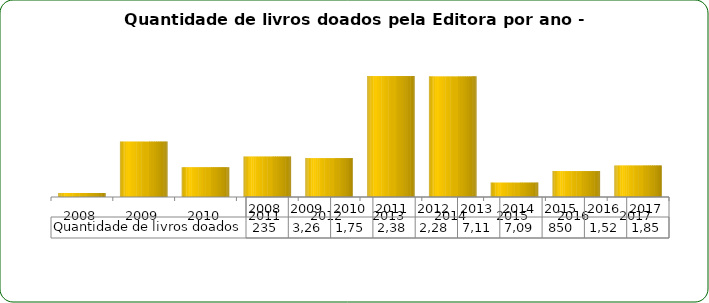
| Category | Quantidade de livros doados |
|---|---|
| 2008.0 | 235 |
| 2009.0 | 3264 |
| 2010.0 | 1756 |
| 2011.0 | 2385 |
| 2012.0 | 2289 |
| 2013.0 | 7115 |
| 2014.0 | 7096 |
| 2015.0 | 850 |
| 2016.0 | 1526 |
| 2017.0 | 1859 |